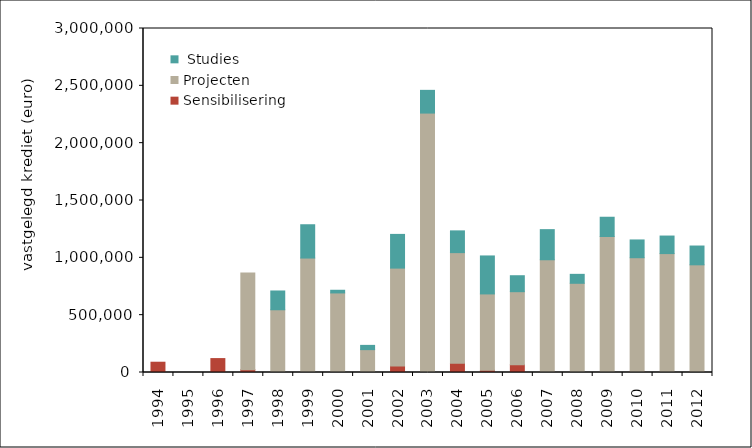
| Category | Sensibilisering | Projecten |  Studies |
|---|---|---|---|
| 1994.0 | 89644.223 | 0 | 0 |
| 1995.0 | 0 | 0 | 0 |
| 1996.0 | 121391.154 | 0 | 0 |
| 1997.0 | 24583.725 | 843640.986 | 0 |
| 1998.0 | 0 | 547110.925 | 163852.959 |
| 1999.0 | 0 | 998125.066 | 290425.782 |
| 2000.0 | 0 | 693825.884 | 23372.195 |
| 2001.0 | 0 | 199301.844 | 37193.94 |
| 2002.0 | 56869.65 | 853507.27 | 293984.87 |
| 2003.0 | 3116.4 | 2259245.39 | 198198.41 |
| 2004.0 | 81253.67 | 964152.98 | 189712.96 |
| 2005.0 | 20086.4 | 665117.45 | 331264.5 |
| 2006.0 | 67703.98 | 637008.51 | 139296.94 |
| 2007.0 | 5500 | 977690.623 | 262689.3 |
| 2008.0 | 0 | 778000 | 78000 |
| 2009.0 | 1000 | 1185000 | 168000 |
| 2010.0 | 9000 | 992000 | 155000 |
| 2011.0 | 2000 | 1035000 | 153000 |
| 2012.0 | 5000 | 934000 | 164000 |